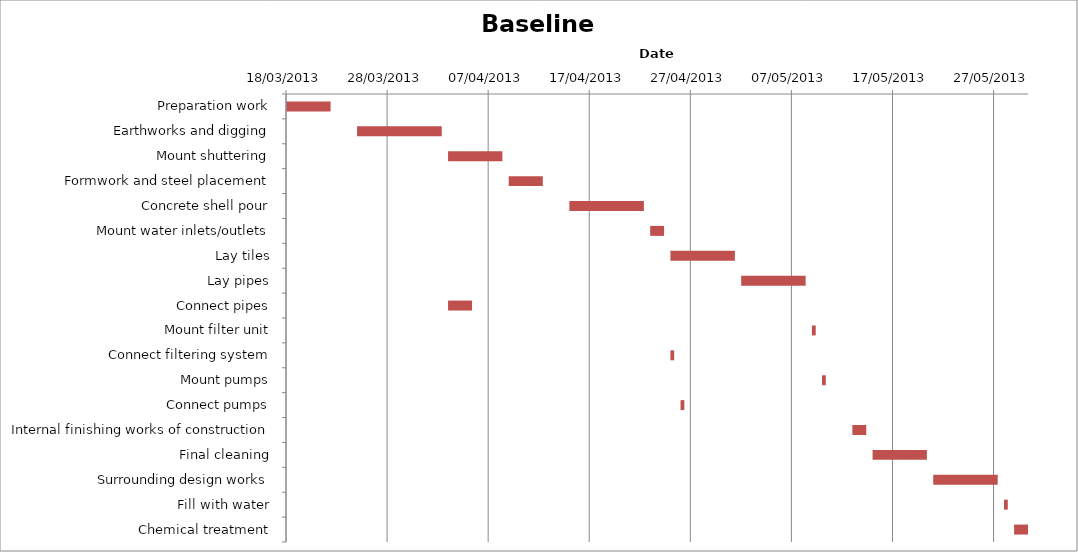
| Category | Baseline start | Actual duration |
|---|---|---|
| Preparation work | 41351.333 | 4.375 |
| Earthworks and digging | 41358.333 | 8.375 |
| Mount shuttering | 41367.333 | 5.375 |
| Formwork and steel placement | 41373.333 | 3.375 |
| Concrete shell pour | 41379.333 | 7.375 |
| Mount water inlets/outlets | 41387.333 | 1.375 |
| Lay tiles | 41389.333 | 6.375 |
| Lay pipes | 41396.333 | 6.375 |
| Connect pipes | 41367.333 | 2.375 |
| Mount filter unit | 41403.333 | 0.375 |
| Connect filtering system | 41389.333 | 0.375 |
| Mount pumps | 41404.333 | 0.375 |
| Connect pumps | 41390.333 | 0.375 |
| Internal finishing works of construction | 41407.333 | 1.375 |
| Final cleaning | 41409.333 | 5.375 |
| Surrounding design works | 41415.333 | 6.375 |
| Fill with water | 41422.333 | 0.375 |
| Chemical treatment | 41423.333 | 1.375 |